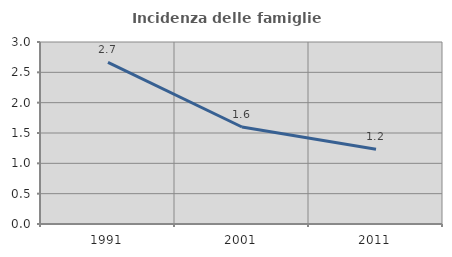
| Category | Incidenza delle famiglie numerose |
|---|---|
| 1991.0 | 2.664 |
| 2001.0 | 1.599 |
| 2011.0 | 1.231 |